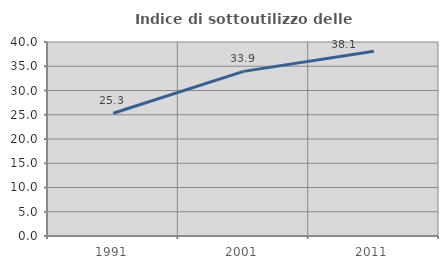
| Category | Indice di sottoutilizzo delle abitazioni  |
|---|---|
| 1991.0 | 25.301 |
| 2001.0 | 33.942 |
| 2011.0 | 38.083 |